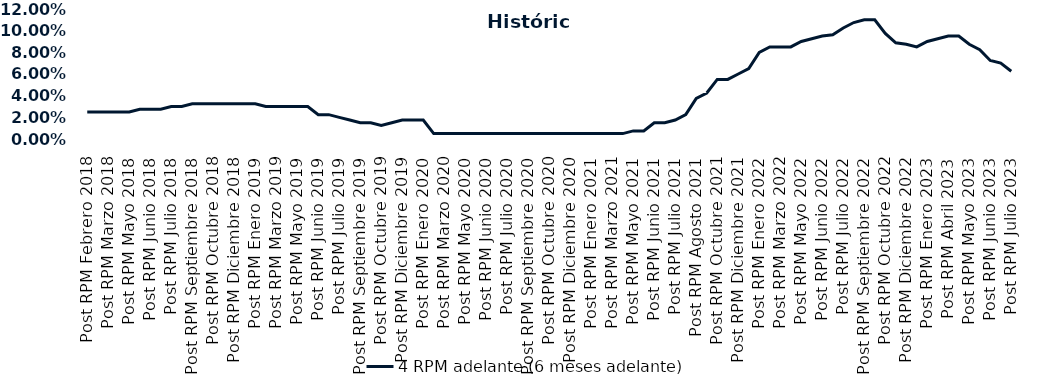
| Category | 4 RPM adelante (6 meses adelante) |
|---|---|
| Post RPM Febrero 2018 | 0.025 |
| Pre RPM Marzo 2018 | 0.025 |
| Post RPM Marzo 2018 | 0.025 |
| Pre RPM Mayo 2018 | 0.025 |
| Post RPM Mayo 2018 | 0.025 |
| Pre RPM Junio 2018 | 0.028 |
| Post RPM Junio 2018 | 0.028 |
| Pre RPM Julio 2018 | 0.028 |
| Post RPM Julio 2018 | 0.03 |
| Pre RPM Septiembre 2018 | 0.03 |
| Post RPM Septiembre 2018 | 0.032 |
| Pre RPM Octubre 2018 | 0.032 |
| Post RPM Octubre 2018 | 0.032 |
| Pre RPM Diciembre 2018 | 0.032 |
| Post RPM Diciembre 2018 | 0.032 |
| Pre RPM Enero 2019 | 0.032 |
| Post RPM Enero 2019 | 0.032 |
| Pre RPM Marzo 2019 | 0.03 |
| Post RPM Marzo 2019 | 0.03 |
| Pre RPM Mayo 2019 | 0.03 |
| Post RPM Mayo 2019 | 0.03 |
| Pre RPM Junio 2019 | 0.03 |
| Post RPM Junio 2019 | 0.022 |
| Pre RPM Julio 2019 | 0.022 |
| Post RPM Julio 2019 | 0.02 |
| Pre RPM Septiembre 2019 | 0.018 |
| Post RPM Septiembre 2019 | 0.015 |
| Pre RPM Octubre 2019 | 0.015 |
| Post RPM Octubre 2019 | 0.012 |
| Pre RPM Diciembre 2019 | 0.015 |
| Post RPM Diciembre 2019 | 0.018 |
| Pre RPM Enero 2020 | 0.018 |
| Post RPM Enero 2020 | 0.018 |
| Pre RPM Marzo 2020 | 0.005 |
| Post RPM Marzo 2020 | 0.005 |
| Pre RPM Mayo 2020 | 0.005 |
| Post RPM Mayo 2020 | 0.005 |
| Pre RPM Junio 2020 | 0.005 |
| Post RPM Junio 2020 | 0.005 |
| Pre RPM Julio 2020 | 0.005 |
| Post RPM Julio 2020 | 0.005 |
| Pre RPM Septiembre 2020 | 0.005 |
| Post RPM Septiembre 2020 | 0.005 |
| Pre RPM Octubre 2020 | 0.005 |
| Post RPM Octubre 2020 | 0.005 |
| Pre RPM Diciembre 2020 | 0.005 |
| Post RPM Diciembre 2020 | 0.005 |
| Pre RPM Enero 2021 | 0.005 |
| Post RPM Enero 2021 | 0.005 |
| Pre RPM Marzo 2021 | 0.005 |
| Post RPM Marzo 2021 | 0.005 |
| Pre RPM Mayo 2021 | 0.005 |
| Post RPM Mayo 2021 | 0.008 |
| Pre RPM Junio 2021 | 0.008 |
| Post RPM Junio 2021 | 0.015 |
| Pre RPM Julio 2021 | 0.015 |
| Post RPM Julio 2021 | 0.018 |
| Pre RPM Agosto 2021 | 0.022 |
| Post RPM Agosto 2021 | 0.038 |
| Pre RPM Octubre 2021 | 0.042 |
| Post RPM Octubre 2021 | 0.055 |
| Pre RPM Diciembre 2021 | 0.055 |
| Post RPM Diciembre 2021 | 0.06 |
| Pre RPM Enero 2022 | 0.065 |
| Post RPM Enero 2022 | 0.08 |
| Pre RPM Marzo 2022 | 0.085 |
| Post RPM Marzo 2022 | 0.085 |
| Pre RPM Mayo 2022 | 0.085 |
| Post RPM Mayo 2022 | 0.09 |
| Pre RPM Junio 2022 | 0.092 |
| Post RPM Junio 2022 | 0.095 |
| Pre RPM Julio 2022 | 0.096 |
| Post RPM Julio 2022 | 0.102 |
| Pre RPM Septiembre 2022 | 0.108 |
| Post RPM Septiembre 2022 | 0.11 |
| Pre RPM Octubre 2022 | 0.11 |
| Post RPM Octubre 2022 | 0.098 |
| Pre RPM Diciembre 2022 | 0.089 |
| Post RPM Diciembre 2022 | 0.088 |
| Pre RPM Enero 2023 | 0.085 |
| Post RPM Enero 2023 | 0.09 |
| Pre RPM Abril 2023 | 0.092 |
| Post RPM Abril 2023 | 0.095 |
| Pre RPM Mayo 2023 | 0.095 |
| Post RPM Mayo 2023 | 0.088 |
| Pre RPM Junio 2023 | 0.082 |
| Post RPM Junio 2023 | 0.072 |
| Pre RPM Julio 2023 | 0.07 |
| Post RPM Julio 2023 | 0.062 |